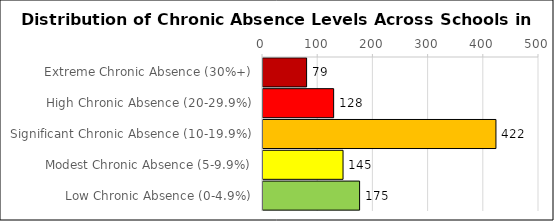
| Category | Number of Schools |
|---|---|
| Extreme Chronic Absence (30%+) | 79 |
| High Chronic Absence (20-29.9%) | 128 |
| Significant Chronic Absence (10-19.9%) | 422 |
| Modest Chronic Absence (5-9.9%) | 145 |
| Low Chronic Absence (0-4.9%) | 175 |